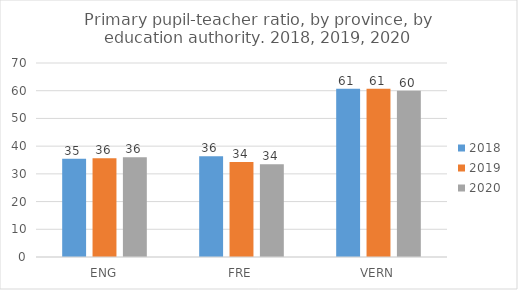
| Category | 2018 | 2019 | 2020 |
|---|---|---|---|
| ENG | 35.416 | 35.614 | 35.994 |
| FRE | 36.319 | 34.254 | 33.511 |
| VERN | 60.667 | 60.667 | 60 |